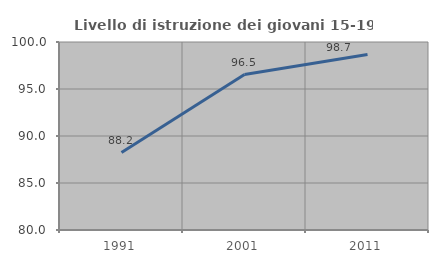
| Category | Livello di istruzione dei giovani 15-19 anni |
|---|---|
| 1991.0 | 88.235 |
| 2001.0 | 96.535 |
| 2011.0 | 98.675 |